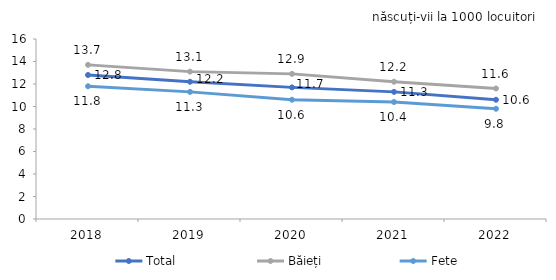
| Category | Total  | Băieți | Fete |
|---|---|---|---|
| 2018.0 | 12.8 | 13.7 | 11.8 |
| 2019.0 | 12.2 | 13.1 | 11.3 |
| 2020.0 | 11.7 | 12.9 | 10.6 |
| 2021.0 | 11.3 | 12.2 | 10.4 |
| 2022.0 | 10.6 | 11.6 | 9.8 |